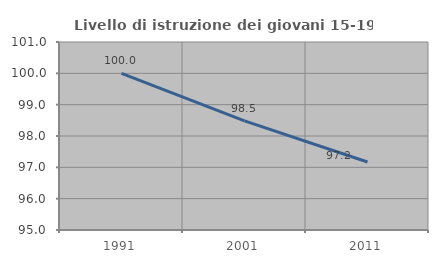
| Category | Livello di istruzione dei giovani 15-19 anni |
|---|---|
| 1991.0 | 100 |
| 2001.0 | 98.485 |
| 2011.0 | 97.17 |